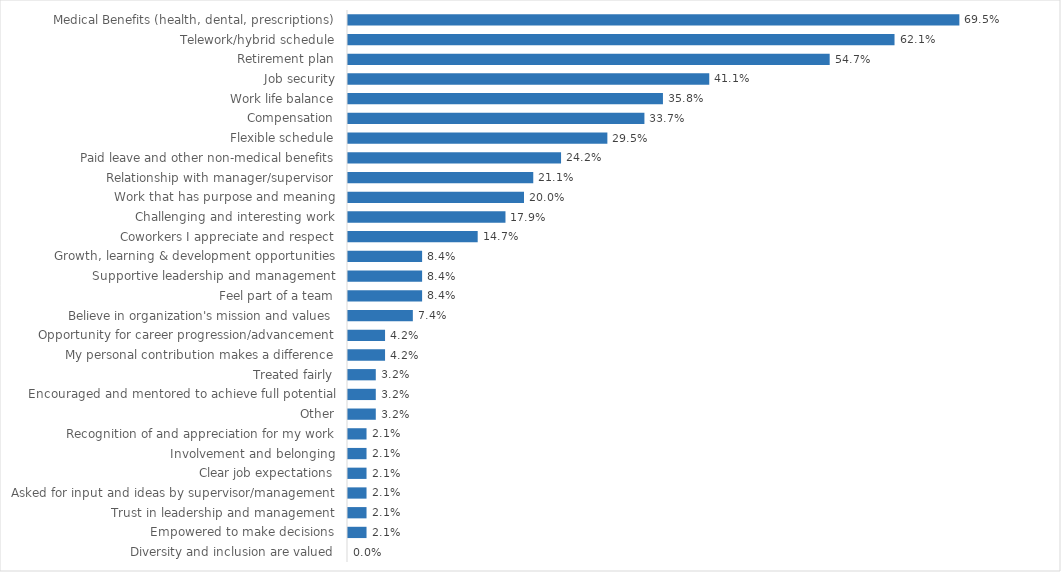
| Category | Human Resources |
|---|---|
| Medical Benefits (health, dental, prescriptions) | 0.695 |
| Telework/hybrid schedule | 0.621 |
| Retirement plan | 0.547 |
| Job security | 0.411 |
| Work life balance | 0.358 |
| Compensation | 0.337 |
| Flexible schedule | 0.295 |
| Paid leave and other non-medical benefits | 0.242 |
| Relationship with manager/supervisor | 0.211 |
| Work that has purpose and meaning | 0.2 |
| Challenging and interesting work | 0.179 |
| Coworkers I appreciate and respect | 0.147 |
| Growth, learning & development opportunities | 0.084 |
| Supportive leadership and management | 0.084 |
| Feel part of a team | 0.084 |
| Believe in organization's mission and values | 0.074 |
| Opportunity for career progression/advancement | 0.042 |
| My personal contribution makes a difference | 0.042 |
| Treated fairly | 0.032 |
| Encouraged and mentored to achieve full potential | 0.032 |
| Other | 0.032 |
| Recognition of and appreciation for my work | 0.021 |
| Involvement and belonging | 0.021 |
| Clear job expectations | 0.021 |
| Asked for input and ideas by supervisor/management | 0.021 |
| Trust in leadership and management | 0.021 |
| Empowered to make decisions | 0.021 |
| Diversity and inclusion are valued | 0 |